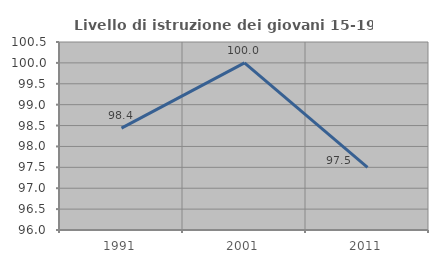
| Category | Livello di istruzione dei giovani 15-19 anni |
|---|---|
| 1991.0 | 98.438 |
| 2001.0 | 100 |
| 2011.0 | 97.5 |